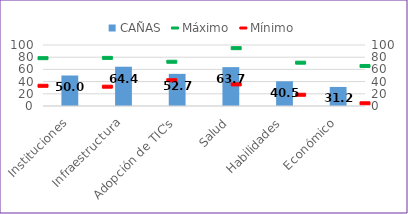
| Category | CAÑAS |
|---|---|
| Instituciones | 50.014 |
| Infraestructura | 64.399 |
| Adopción de TIC's | 52.702 |
| Salud | 63.747 |
| Habilidades | 40.499 |
| Económico | 31.244 |